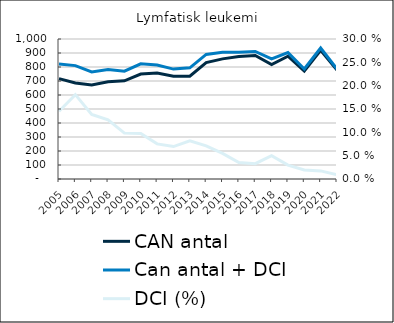
| Category |  CAN antal  |  Can antal + DCI  |
|---|---|---|
| 2005.0 | 717 | 821 |
| 2006.0 | 686 | 810 |
| 2007.0 | 672 | 765 |
| 2008.0 | 694 | 782 |
| 2009.0 | 701 | 770 |
| 2010.0 | 750 | 823 |
| 2011.0 | 757 | 814 |
| 2012.0 | 734 | 785 |
| 2013.0 | 734 | 794 |
| 2014.0 | 831 | 890 |
| 2015.0 | 858 | 905 |
| 2016.0 | 875 | 906 |
| 2017.0 | 882 | 911 |
| 2018.0 | 817 | 858 |
| 2019.0 | 877 | 903 |
| 2020.0 | 771 | 786 |
| 2021.0 | 920 | 936 |
| 2022.0 | 778 | 785 |